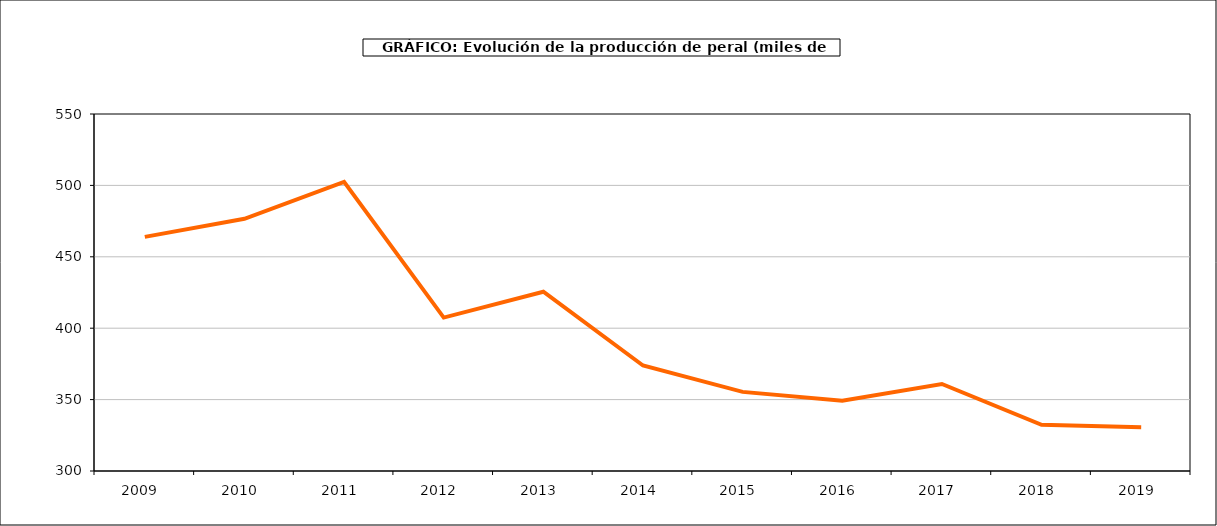
| Category | producción peral |
|---|---|
| 2009.0 | 463.969 |
| 2010.0 | 476.586 |
| 2011.0 | 502.434 |
| 2012.0 | 407.428 |
| 2013.0 | 425.56 |
| 2014.0 | 373.865 |
| 2015.0 | 355.41 |
| 2016.0 | 349.247 |
| 2017.0 | 360.957 |
| 2018.0 | 332.319 |
| 2019.0 | 330.67 |